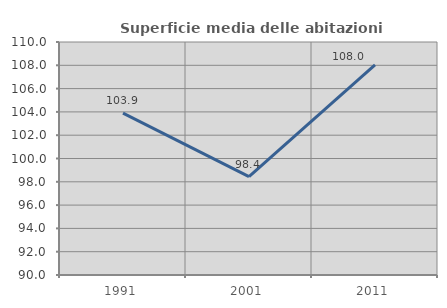
| Category | Superficie media delle abitazioni occupate |
|---|---|
| 1991.0 | 103.895 |
| 2001.0 | 98.445 |
| 2011.0 | 108.033 |